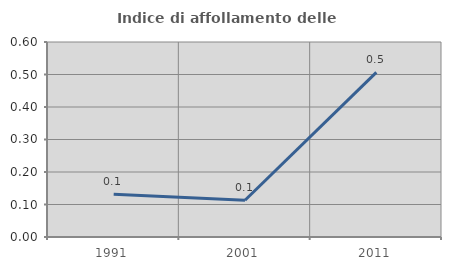
| Category | Indice di affollamento delle abitazioni  |
|---|---|
| 1991.0 | 0.132 |
| 2001.0 | 0.113 |
| 2011.0 | 0.507 |